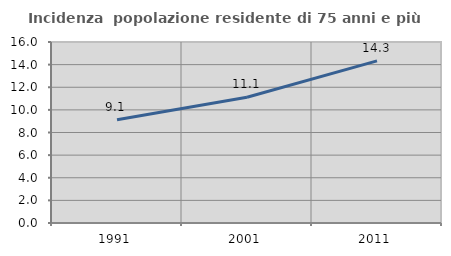
| Category | Incidenza  popolazione residente di 75 anni e più |
|---|---|
| 1991.0 | 9.129 |
| 2001.0 | 11.114 |
| 2011.0 | 14.331 |